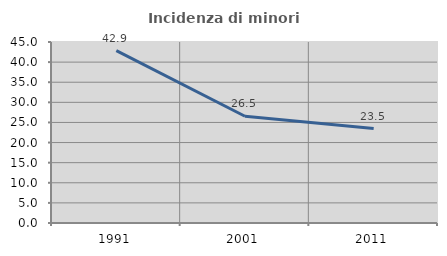
| Category | Incidenza di minori stranieri |
|---|---|
| 1991.0 | 42.857 |
| 2001.0 | 26.531 |
| 2011.0 | 23.478 |